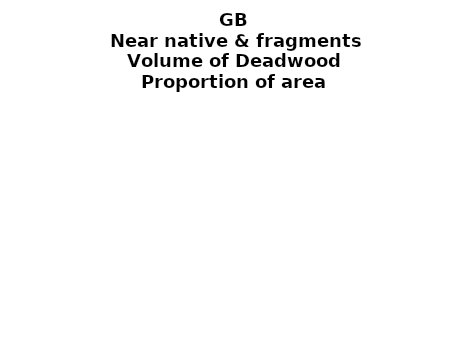
| Category | Near native & fragments |
|---|---|
|  None | 0.009 |
| >0 and ≤ 10 | 0.004 |
| >10 and ≤ 20  | 0.002 |
| >20 and ≤ 30  | 0.001 |
| >30 and ≤ 40  | 0.001 |
| >40 and ≤ 50  | 0 |
| >50 and ≤ 60  | 0 |
| >60 and ≤ 70  | 0 |
| >70 and ≤ 80  | 0 |
| >80 and ≤ 90  | 0 |
| >90 and ≤ 100  | 0 |
| >100 and ≤ 150 | 0.001 |
| >150 and ≤ 200  | 0 |
| >200 and ≤ 500 | 0 |
| >500   | 0 |